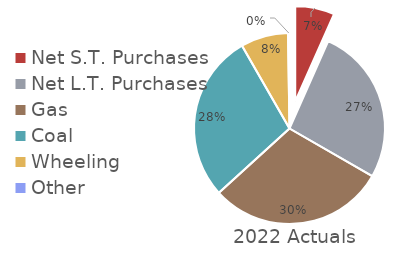
| Category | 2022 Actuals |
|---|---|
| Net S.T. Purchases | 135625309.71 |
| Net L.T. Purchases | 544173647.238 |
| Gas | 610525466.31 |
| Coal  | 580834961.13 |
| Wheeling | 164088726.98 |
| Other | 5070192.1 |